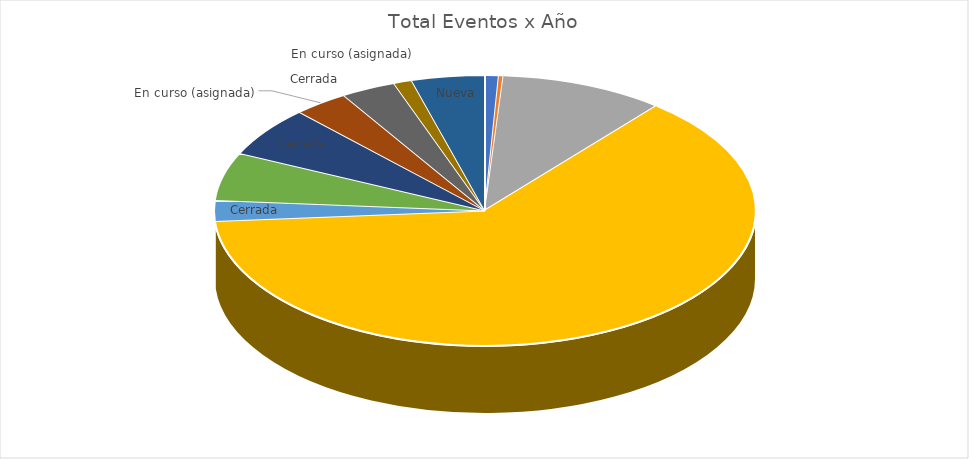
| Category | Total |
|---|---|
| 0 | 3 |
| 1 | 1 |
| 2 | 36 |
| 3 | 230 |
| 4 | 9 |
| 5 | 21 |
| 6 | 22 |
| 7 | 12 |
| 8 | 12 |
| 9 | 4 |
| 10 | 16 |